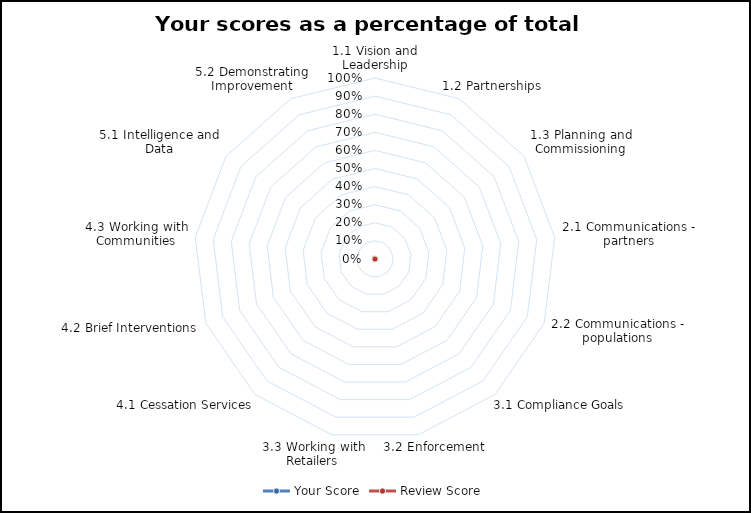
| Category | Your Score | Review Score |
|---|---|---|
| 1.1 Vision and Leadership | 0 | 0 |
| 1.2 Partnerships | 0 | 0 |
| 1.3 Planning and Commissioning | 0 | 0 |
| 2.1 Communications - partners | 0 | 0 |
| 2.2 Communications - populations | 0 | 0 |
| 3.1 Compliance Goals | 0 | 0 |
| 3.2 Enforcement | 0 | 0 |
| 3.3 Working with Retailers | 0 | 0 |
| 4.1 Cessation Services | 0 | 0 |
| 4.2 Brief Interventions | 0 | 0 |
| 4.3 Working with Communities | 0 | 0 |
| 5.1 Intelligence and Data | 0 | 0 |
| 5.2 Demonstrating Improvement | 0 | 0 |